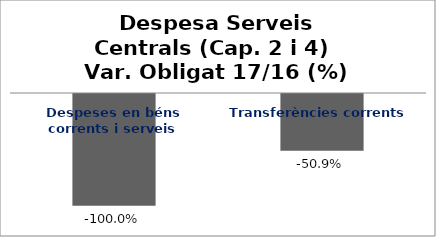
| Category | Series 0 |
|---|---|
| Despeses en béns corrents i serveis | -1 |
| Transferències corrents | -0.509 |